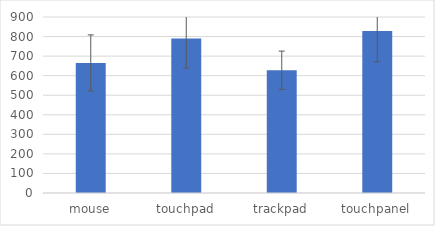
| Category | Series 0 |
|---|---|
| mouse | 665.216 |
| touchpad | 790.224 |
| trackpad | 627.607 |
| touchpanel | 828.67 |